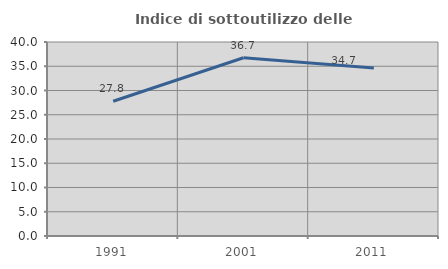
| Category | Indice di sottoutilizzo delle abitazioni  |
|---|---|
| 1991.0 | 27.778 |
| 2001.0 | 36.743 |
| 2011.0 | 34.659 |